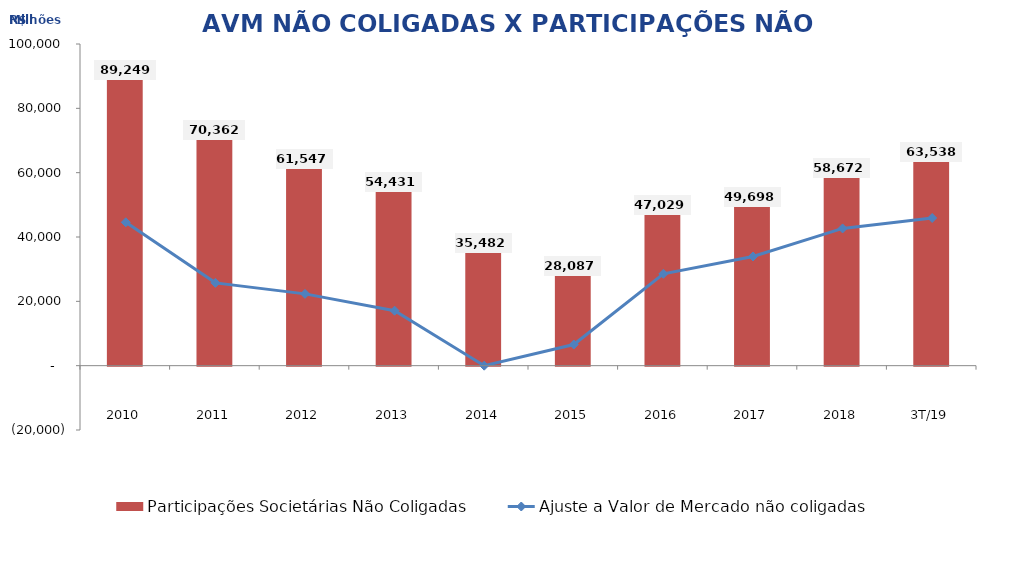
| Category | Participações Societárias Não Coligadas |
|---|---|
| 2010 | 89249.116 |
| 2011 | 70361.989 |
| 2012 | 61547.222 |
| 2013 | 54430.571 |
| 2014 | 35481.7 |
| 2015 | 28086.586 |
| 2016 | 47028.593 |
| 2017 | 49697.568 |
| 2018 | 58671.648 |
| 3T/19 | 63538.458 |